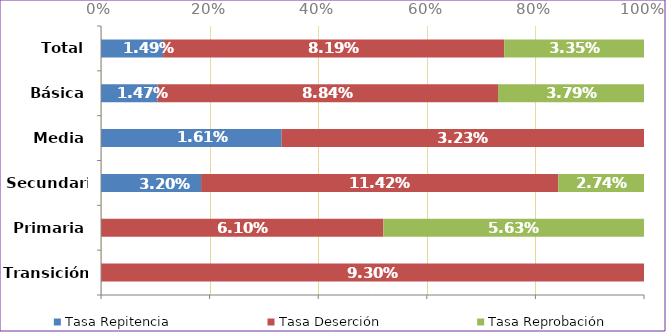
| Category | Tasa Repitencia | Tasa Deserción | Tasa Reprobación |
|---|---|---|---|
| Transición | 0 | 0.093 | 0 |
| Primaria | 0 | 0.061 | 0.056 |
| Secundaria | 0.032 | 0.114 | 0.027 |
| Media | 0.016 | 0.032 | 0 |
| Básica | 0.015 | 0.088 | 0.038 |
| Total | 0.015 | 0.082 | 0.034 |